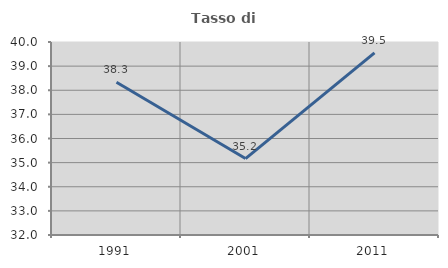
| Category | Tasso di occupazione   |
|---|---|
| 1991.0 | 38.333 |
| 2001.0 | 35.168 |
| 2011.0 | 39.549 |